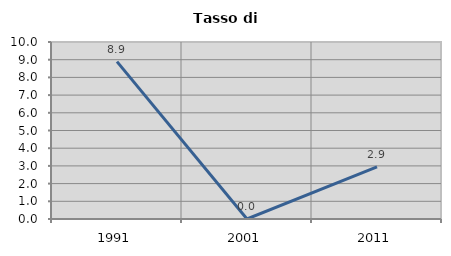
| Category | Tasso di disoccupazione   |
|---|---|
| 1991.0 | 8.889 |
| 2001.0 | 0 |
| 2011.0 | 2.941 |